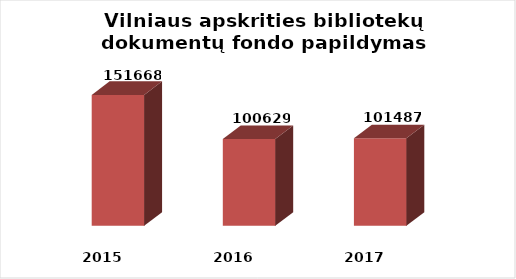
| Category | Series 0 |
|---|---|
| 2015.0 | 151668 |
| 2016.0 | 100629 |
| 2017.0 | 101487 |